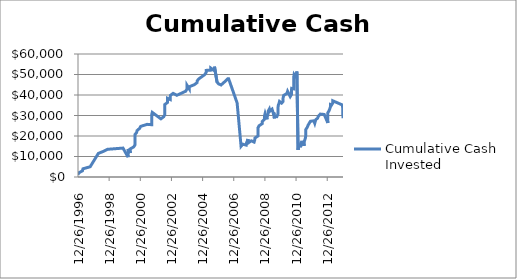
| Category | Cumulative Cash Invested |
|---|---|
| 12/26/96 | 1000 |
| 1/9/97 | 2000 |
| 4/8/97 | 3000 |
| 4/21/97 | 4000 |
| 10/7/97 | 5000 |
| 4/17/98 | 11509 |
| 8/13/98 | 12509 |
| 11/16/98 | 13509 |
| 11/16/99 | 14100 |
| 3/14/00 | 9684 |
| 3/14/00 | 10684 |
| 3/14/00 | 11684 |
| 3/14/00 | 12684 |
| 3/14/00 | 13684 |
| 5/3/00 | 11684 |
| 5/3/00 | 12684 |
| 5/3/00 | 13684 |
| 7/24/00 | 14684 |
| 8/22/00 | 15684 |
| 8/22/00 | 16684 |
| 8/22/00 | 17684 |
| 8/22/00 | 18684 |
| 8/22/00 | 19684 |
| 8/22/00 | 20684 |
| 9/29/00 | 21684 |
| 10/12/00 | 22684 |
| 12/8/00 | 23684 |
| 1/3/01 | 24684 |
| 6/4/01 | 25684 |
| 9/18/01 | 25508 |
| 9/18/01 | 26508 |
| 9/18/01 | 27508 |
| 9/18/01 | 28508 |
| 9/18/01 | 29508 |
| 9/20/01 | 30508 |
| 10/2/01 | 31508 |
| 4/22/02 | 28384 |
| 6/26/02 | 29384 |
| 7/24/02 | 30384 |
| 7/24/02 | 31384 |
| 7/24/02 | 32384 |
| 7/24/02 | 33384 |
| 7/24/02 | 34384 |
| 7/24/02 | 35384 |
| 9/26/02 | 36384 |
| 9/26/02 | 37384 |
| 9/26/02 | 38384 |
| 11/25/02 | 37811 |
| 11/25/02 | 38811 |
| 12/2/02 | 39811 |
| 2/3/03 | 40811 |
| 5/1/03 | 39858 |
| 8/14/03 | 40858 |
| 11/25/03 | 41858 |
| 12/23/03 | 42858 |
| 12/23/03 | 43858 |
| 12/23/03 | 44858 |
| 2/16/04 | 43022 |
| 2/16/04 | 44022 |
| 6/14/04 | 45022 |
| 8/16/04 | 46022 |
| 8/23/04 | 47022 |
| 10/7/04 | 48022 |
| 10/18/04 | 48007 |
| 12/13/04 | 49007 |
| 2/17/05 | 50007 |
| 3/18/05 | 51007 |
| 3/18/05 | 52007 |
| 7/6/05 | 52125 |
| 7/6/05 | 53125 |
| 9/30/05 | 51837 |
| 9/30/05 | 52837 |
| 9/30/05 | 53837 |
| 11/29/05 | 46322 |
| 1/2/06 | 45447 |
| 1/6/06 | 45747 |
| 3/3/06 | 44895 |
| 4/26/06 | 45895 |
| 6/20/06 | 46895 |
| 8/4/06 | 47895 |
| 8/28/06 | 47902 |
| 3/15/07 | 36099 |
| 6/15/07 | 15008 |
| 7/25/07 | 16008 |
| 10/12/07 | 15563 |
| 10/19/07 | 16563 |
| 11/8/07 | 17563 |
| 11/23/07 | 18563 |
| 11/26/07 | 16563 |
| 2/11/08 | 17653 |
| 4/16/08 | 17027 |
| 4/30/08 | 18027 |
| 5/7/08 | 19027 |
| 7/16/08 | 20027 |
| 7/16/08 | 21027 |
| 7/16/08 | 22027 |
| 7/16/08 | 23027 |
| 7/16/08 | 24027 |
| 8/12/08 | 25027 |
| 10/23/08 | 26027 |
| 10/23/08 | 27027 |
| 12/10/08 | 28027 |
| 12/18/08 | 29027 |
| 12/18/08 | 30027 |
| 12/30/08 | 31027 |
| 2/11/09 | 28134 |
| 2/11/09 | 29134 |
| 3/2/09 | 30134 |
| 3/12/09 | 31134 |
| 3/12/09 | 32134 |
| 4/8/09 | 33143 |
| 4/20/09 | 32065 |
| 6/11/09 | 33065 |
| 7/20/09 | 30437 |
| 7/22/09 | 31437 |
| 8/5/09 | 28628 |
| 8/5/09 | 29628 |
| 10/1/09 | 29432 |
| 10/13/09 | 29829 |
| 10/19/09 | 29860 |
| 10/29/09 | 30860 |
| 10/29/09 | 31860 |
| 10/29/09 | 32860 |
| 10/30/09 | 33860 |
| 11/2/09 | 34860 |
| 11/20/09 | 35860 |
| 12/3/09 | 36860 |
| 1/21/10 | 36034 |
| 2/22/10 | 36784 |
| 2/24/10 | 37784 |
| 2/26/10 | 38784 |
| 3/10/10 | 39784 |
| 5/26/10 | 40784 |
| 6/10/10 | 41784 |
| 8/11/10 | 39238 |
| 9/9/10 | 40238 |
| 9/10/10 | 41238 |
| 9/10/10 | 42238 |
| 9/13/10 | 43238 |
| 11/3/10 | 42986 |
| 11/3/10 | 43986 |
| 11/3/10 | 44986 |
| 11/3/10 | 45986 |
| 11/3/10 | 46986 |
| 11/3/10 | 47986 |
| 11/3/10 | 48986 |
| 11/10/10 | 49986 |
| 12/15/10 | 48912 |
| 1/13/11 | 48493 |
| 1/13/11 | 49493 |
| 1/13/11 | 50493 |
| 1/13/11 | 51493 |
| 2/11/11 | 13202 |
| 2/18/11 | 14202 |
| 3/24/11 | 15202 |
| 4/11/11 | 16202 |
| 4/25/11 | 15652 |
| 5/17/11 | 16652 |
| 5/26/11 | 17652 |
| 6/8/11 | 17411 |
| 6/28/11 | 15197 |
| 7/5/11 | 16197 |
| 7/5/11 | 17197 |
| 7/21/11 | 18197 |
| 8/4/11 | 19197 |
| 8/9/11 | 20197 |
| 8/9/11 | 21197 |
| 8/9/11 | 22197 |
| 8/12/11 | 23197 |
| 9/13/11 | 24197 |
| 9/23/11 | 24291 |
| 10/5/11 | 25291 |
| 11/1/11 | 26291 |
| 11/29/11 | 27183 |
| 2/15/12 | 27403 |
| 3/8/12 | 26179 |
| 3/21/12 | 27179 |
| 4/4/12 | 28005 |
| 5/14/12 | 28692 |
| 5/31/12 | 29692 |
| 7/16/12 | 30692 |
| 10/16/12 | 30505 |
| 1/9/13 | 26354 |
| 1/9/13 | 27354 |
| 1/9/13 | 28354 |
| 1/9/13 | 29354 |
| 1/9/13 | 30354 |
| 1/9/13 | 31354 |
| 2/7/13 | 32354 |
| 2/25/13 | 33354 |
| 3/14/13 | 34354 |
| 3/14/13 | 35354 |
| 3/15/13 | 35651 |
| 4/8/13 | 35158 |
| 5/7/13 | 36158 |
| 5/7/13 | 37158 |
| 12/20/13 | 35099 |
| 12/30/13 | 28618 |